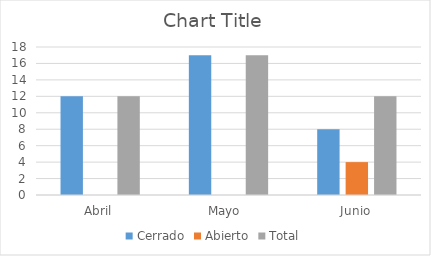
| Category | Cerrado | Abierto | Total |
|---|---|---|---|
| Abril | 12 | 0 | 12 |
| Mayo  | 17 | 0 | 17 |
| Junio | 8 | 4 | 12 |